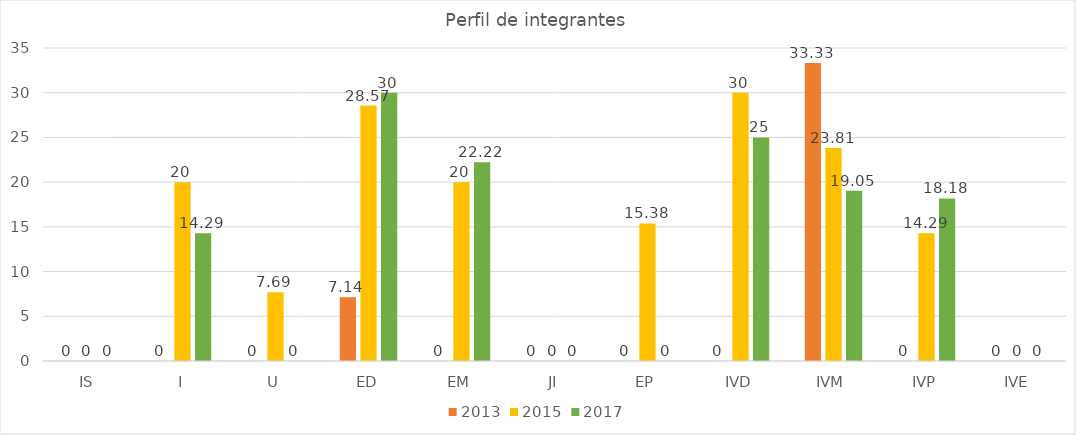
| Category | 2013 | 2015 | 2017 |
|---|---|---|---|
| IS | 0 | 0 | 0 |
| I | 0 | 20 | 14.29 |
| U | 0 | 7.69 | 0 |
| ED | 7.14 | 28.57 | 30 |
| EM | 0 | 20 | 22.22 |
| JI | 0 | 0 | 0 |
| EP | 0 | 15.38 | 0 |
| IVD | 0 | 30 | 25 |
| IVM | 33.33 | 23.81 | 19.05 |
| IVP | 0 | 14.29 | 18.18 |
| IVE | 0 | 0 | 0 |